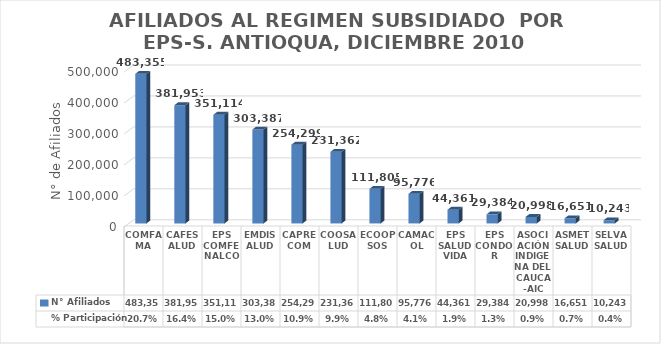
| Category | N° Afiliados | % Participación |
|---|---|---|
| COMFAMA | 483355 | 0.207 |
| CAFESALUD | 381953 | 0.164 |
| EPS COMFENALCO | 351114 | 0.15 |
| EMDISALUD | 303387 | 0.13 |
| CAPRECOM | 254299 | 0.109 |
| COOSALUD | 231362 | 0.099 |
| ECOOPSOS | 111805 | 0.048 |
| CAMACOL | 95776 | 0.041 |
| EPS SALUDVIDA | 44361 | 0.019 |
| EPS CONDOR | 29384 | 0.013 |
| ASOCIACIÓN INDIGENA DEL CAUCA -AIC | 20998 | 0.009 |
| ASMETSALUD | 16651 | 0.007 |
| SELVA SALUD | 10243 | 0.004 |